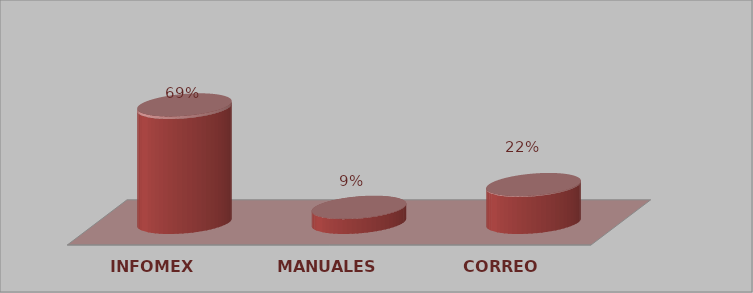
| Category | Series 0 | Series 1 |
|---|---|---|
| INFOMEX | 31 | 0.689 |
| MANUALES | 4 | 0.089 |
| CORREO | 10 | 0.222 |